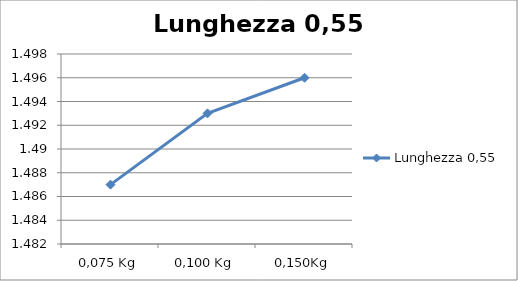
| Category | Lunghezza 0,55 |
|---|---|
| 0,075 Kg | 1.487 |
| 0,100 Kg | 1.493 |
| 0,150Kg | 1.496 |